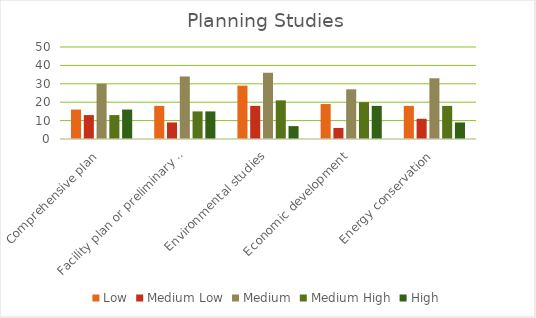
| Category | Low | Medium Low | Medium | Medium High | High |
|---|---|---|---|---|---|
| Comprehensive plan | 16 | 13 | 30 | 13 | 16 |
| Facility plan or preliminary engineering | 18 | 9 | 34 | 15 | 15 |
| Environmental studies | 29 | 18 | 36 | 21 | 7 |
| Economic development | 19 | 6 | 27 | 20 | 18 |
| Energy conservation | 18 | 11 | 33 | 18 | 9 |